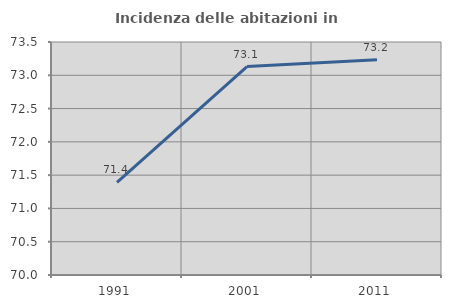
| Category | Incidenza delle abitazioni in proprietà  |
|---|---|
| 1991.0 | 71.391 |
| 2001.0 | 73.131 |
| 2011.0 | 73.234 |